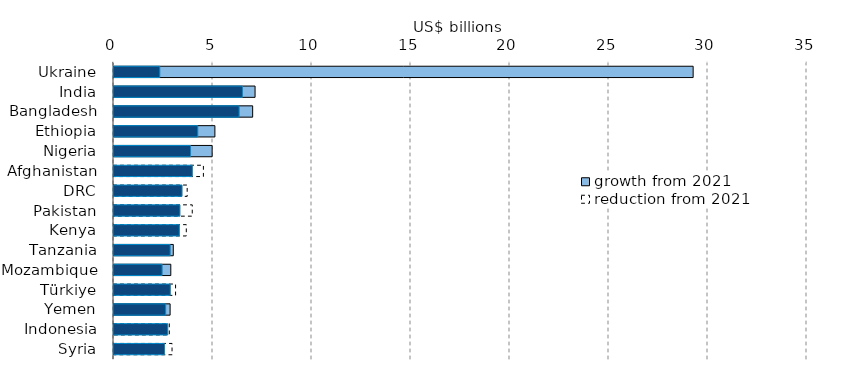
| Category | growth from 2021 | reduction from 2021 | Series 0 |
|---|---|---|---|
| Ukraine | 29249.696 | 0 | 2313.721 |
| India | 7125.052 | 0 | 6486.257 |
| Bangladesh | 7003.59 | 0 | 6318.807 |
| Ethiopia | 5095.934 | 0 | 4231.443 |
| Nigeria | 4956.057 | 0 | 3866.64 |
| Afghanistan | 0 | 4515.319 | 3956.886 |
| DRC | 0 | 3696.051 | 3436.93 |
| Pakistan | 0 | 3952.769 | 3331.556 |
| Kenya | 0 | 3651.639 | 3301.464 |
| Tanzania | 2994.136 | 0 | 2835.548 |
| Mozambique | 2868.536 | 0 | 2429.697 |
| Türkiye | 0 | 3109.75 | 2844.075 |
| Yemen | 2834.221 | 0 | 2610.332 |
| Indonesia | 0 | 2792.623 | 2717.721 |
| Syria | 0 | 2931.081 | 2552.203 |